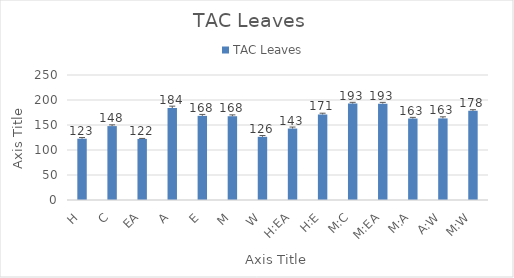
| Category | TAC Leaves   |
|---|---|
| H | 122.607 |
| C | 147.802 |
| EA | 122.125 |
| A | 183.912 |
| E | 168.245 |
| M | 167.545 |
| W | 126.35 |
| H:EA | 142.939 |
| H:E | 171.139 |
| M:C | 192.814 |
| M:EA | 192.743 |
| M:A | 162.975 |
| A:W | 163.199 |
| M:W | 178.302 |